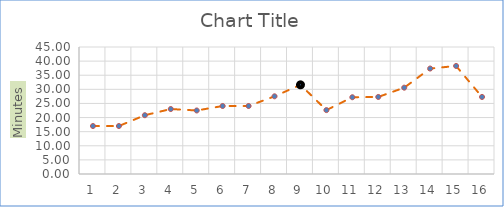
| Category | Series 0 |
|---|---|
| 0 | 17 |
| 1 | 17 |
| 2 | 20.83 |
| 3 | 23.02 |
| 4 | 22.51 |
| 5 | 24.09 |
| 6 | 24.09 |
| 7 | 27.53 |
| 8 | 31.59 |
| 9 | 22.64 |
| 10 | 27.2 |
| 11 | 27.3 |
| 12 | 30.59 |
| 13 | 37.37 |
| 14 | 38.28 |
| 15 | 27.3 |